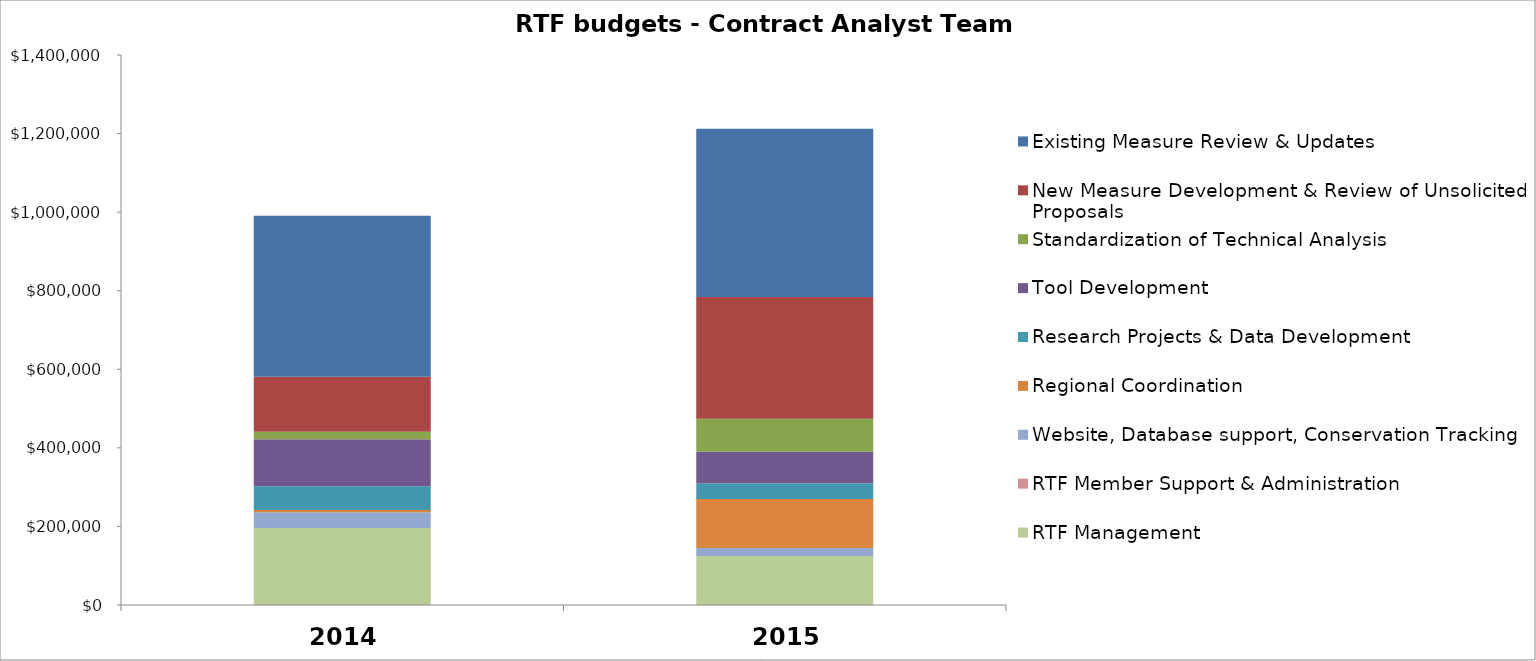
| Category | RTF Management | RTF Member Support & Administration | Website, Database support, Conservation Tracking  | Regional Coordination | Research Projects & Data Development | Tool Development | Standardization of Technical Analysis | New Measure Development & Review of Unsolicited Proposals | Existing Measure Review & Updates |
|---|---|---|---|---|---|---|---|---|---|
| 0 | 196000 | 0 | 40000 | 6000 | 60000 | 120000 | 19000 | 140000 | 410000 |
| 1 | 125000 | 0 | 20000 | 125000 | 40000 | 80000 | 84000 | 310000 | 428000 |